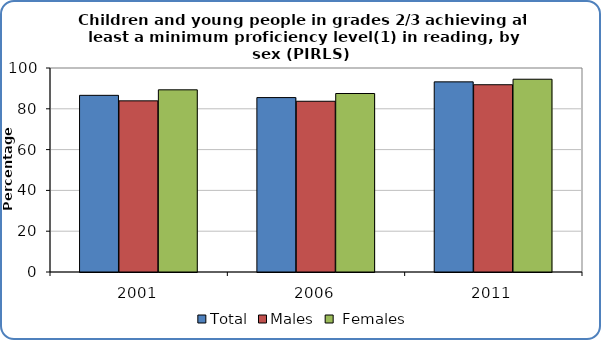
| Category | Total | Males |  Females |
|---|---|---|---|
| 2001.0 | 86.6 | 83.9 | 89.3 |
| 2006.0 | 85.5 | 83.7 | 87.5 |
| 2011.0 | 93.2 | 91.8 | 94.5 |